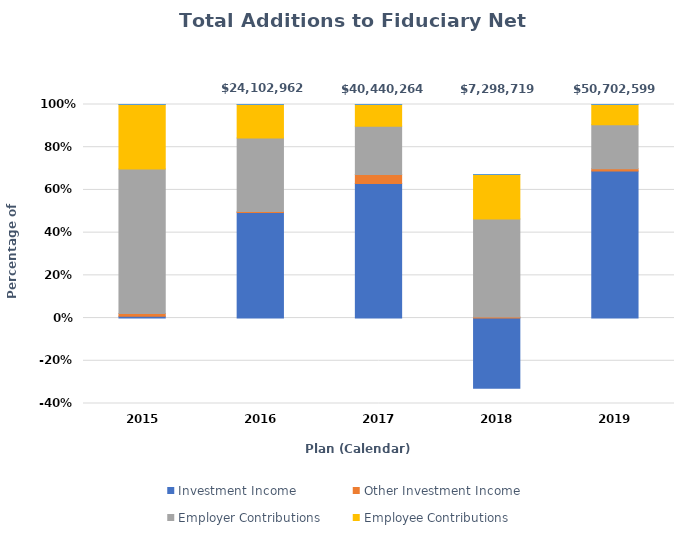
| Category | Investment Income | Other Investment Income | Employer Contributions | Employee Contributions | Plan Year |
|---|---|---|---|---|---|
| 2015.0 | 101484 | 151384 | 8195714 | 3644800 | 2014 |
| 2016.0 | 11912210 | 109293 | 8302118 | 3779341 | 2015 |
| 2017.0 | 25464716 | 1722858 | 9138705 | 4113985 | 2016 |
| 2018.0 | -6966809 | 105319 | 9753253 | 4406956 | 2017 |
| 2019.0 | 34932258 | 505892 | 10471204 | 4793245 | 2018 |